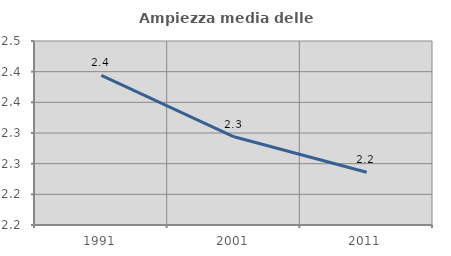
| Category | Ampiezza media delle famiglie |
|---|---|
| 1991.0 | 2.394 |
| 2001.0 | 2.294 |
| 2011.0 | 2.236 |